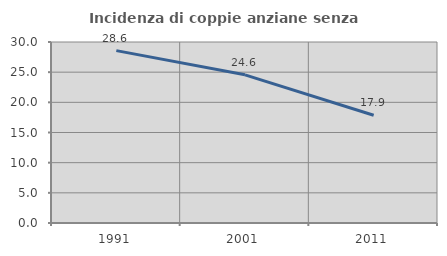
| Category | Incidenza di coppie anziane senza figli  |
|---|---|
| 1991.0 | 28.571 |
| 2001.0 | 24.561 |
| 2011.0 | 17.857 |